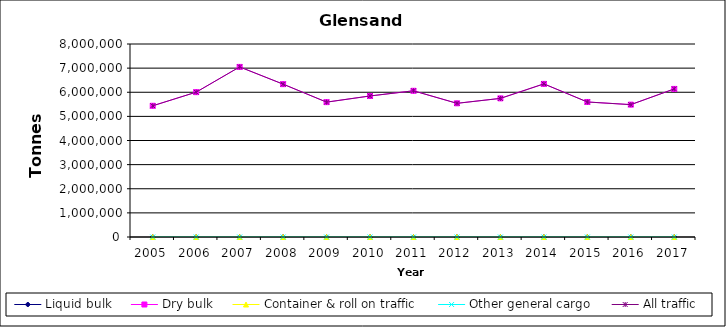
| Category | Liquid bulk | Dry bulk | Container & roll on traffic | Other general cargo | All traffic |
|---|---|---|---|---|---|
| 2005.0 | 0 | 5439000 | 0 | 0 | 5439000 |
| 2006.0 | 0 | 6004000 | 0 | 0 | 6004000 |
| 2007.0 | 0 | 7050000 | 0 | 0 | 7050000 |
| 2008.0 | 0 | 6336000 | 0 | 0 | 6336000 |
| 2009.0 | 0 | 5590653 | 0 | 0 | 5590653 |
| 2010.0 | 0 | 5846000 | 0 | 0 | 5846000 |
| 2011.0 | 0 | 6060000 | 0 | 0 | 6060000 |
| 2012.0 | 0 | 5541000 | 0 | 0 | 5541000 |
| 2013.0 | 0 | 5746000 | 0 | 0 | 5746000 |
| 2014.0 | 0 | 6347000 | 0 | 0 | 6347000 |
| 2015.0 | 0 | 5597000 | 0 | 0 | 5597000 |
| 2016.0 | 0 | 5487000 | 0 | 0 | 5487000 |
| 2017.0 | 0 | 6138000 | 0 | 0 | 6138000 |